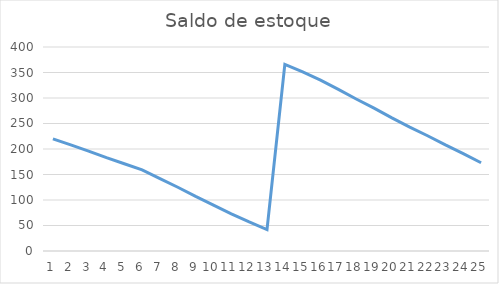
| Category | Saldo inicial |
|---|---|
| 0 | 220 |
| 1 | 208 |
| 2 | 196 |
| 3 | 183 |
| 4 | 171 |
| 5 | 159 |
| 6 | 142 |
| 7 | 125 |
| 8 | 107 |
| 9 | 90 |
| 10 | 73 |
| 11 | 57 |
| 12 | 42 |
| 13 | 366 |
| 14 | 351 |
| 15 | 335 |
| 16 | 317 |
| 17 | 298 |
| 18 | 280 |
| 19 | 261 |
| 20 | 243 |
| 21 | 226 |
| 22 | 208 |
| 23 | 191 |
| 24 | 173 |